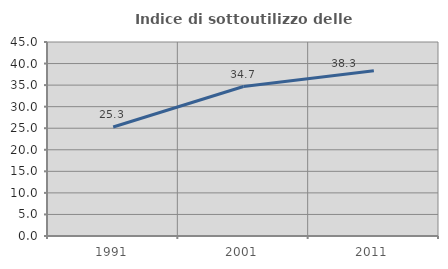
| Category | Indice di sottoutilizzo delle abitazioni  |
|---|---|
| 1991.0 | 25.29 |
| 2001.0 | 34.67 |
| 2011.0 | 38.341 |